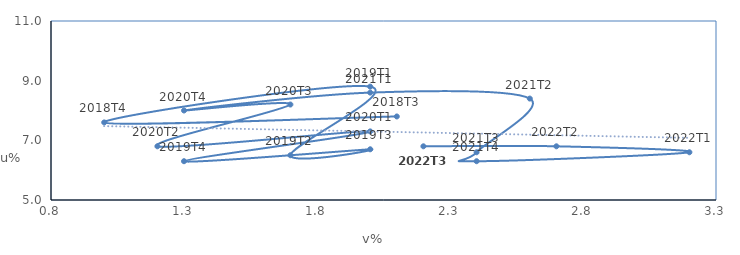
| Category | Ποσοστό κενών θέσεων & Ανεργίας |
|---|---|
| 2.1 | 7.8 |
| 1.0 | 7.6 |
| 2.0 | 8.8 |
| 1.7 | 6.5 |
| 2.0 | 6.7 |
| 1.3 | 6.3 |
| 2.0 | 7.3 |
| 1.2 | 6.8 |
| 1.7 | 8.2 |
| 1.3 | 8 |
| 2.0 | 8.6 |
| 2.6 | 8.4 |
| 2.4 | 6.6 |
| 2.4 | 6.3 |
| 3.2 | 6.6 |
| 2.7 | 6.8 |
| 2.2 | 6.8 |